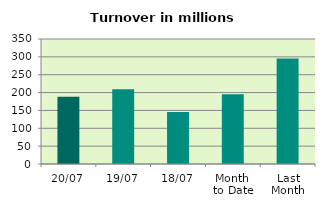
| Category | Series 0 |
|---|---|
| 20/07 | 188.425 |
| 19/07 | 209.124 |
| 18/07 | 145.871 |
| Month 
to Date | 194.967 |
| Last
Month | 295.453 |